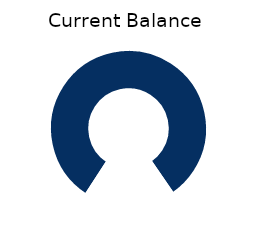
| Category | Current Balance |
|---|---|
| 0 | 130 |
| 1 | 0 |
| 2 | 0 |
| 3 | 30 |